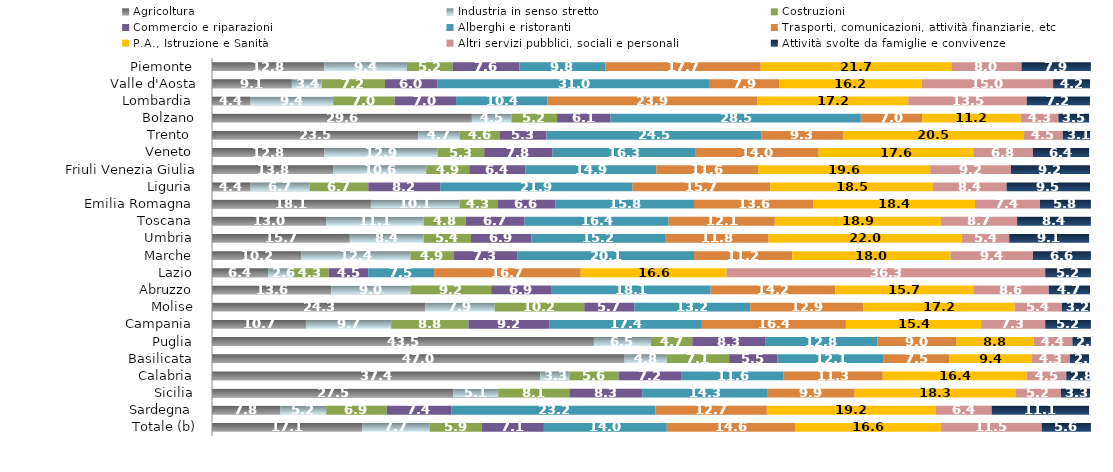
| Category | Agricoltura | Industria in senso stretto | Costruzioni | Commercio e riparazioni | Alberghi e ristoranti | Trasporti, comunicazioni, attività finanziarie, etc | P.A., Istruzione e Sanità | Altri servizi pubblici, sociali e personali | Attività svolte da famiglie e convivenze |
|---|---|---|---|---|---|---|---|---|---|
| Piemonte  | 12.8 | 9.4 | 5.2 | 7.6 | 9.8 | 17.7 | 21.7 | 8 | 7.9 |
| Valle d'Aosta | 9.1 | 3.4 | 7.2 | 6 | 31 | 7.9 | 16.2 | 15 | 4.2 |
| Lombardia  | 4.4 | 9.4 | 7 | 7 | 10.4 | 23.9 | 17.2 | 13.5 | 7.2 |
|           Bolzano | 29.6 | 4.5 | 5.2 | 6.1 | 28.5 | 7 | 11.2 | 4.3 | 3.5 |
|           Trento  | 23.5 | 4.7 | 4.6 | 5.3 | 24.5 | 9.3 | 20.5 | 4.5 | 3.1 |
| Veneto  | 12.8 | 12.9 | 5.3 | 7.8 | 16.3 | 14 | 17.6 | 6.8 | 6.4 |
| Friuli Venezia Giulia | 13.8 | 10.6 | 4.9 | 6.4 | 14.9 | 11.6 | 19.6 | 9.2 | 9.2 |
| Liguria  | 4.4 | 6.7 | 6.7 | 8.2 | 21.9 | 15.7 | 18.5 | 8.4 | 9.5 |
| Emilia Romagna  | 18.1 | 10.1 | 4.3 | 6.6 | 15.8 | 13.6 | 18.4 | 7.4 | 5.8 |
| Toscana  | 13 | 11.1 | 4.8 | 6.7 | 16.4 | 12.1 | 18.9 | 8.7 | 8.4 |
| Umbria  | 15.7 | 8.4 | 5.4 | 6.9 | 15.2 | 11.8 | 22 | 5.4 | 9.1 |
| Marche  | 10.2 | 12.4 | 4.9 | 7.3 | 20.1 | 11.2 | 18 | 9.4 | 6.6 |
| Lazio  | 6.4 | 2.6 | 4.3 | 4.5 | 7.5 | 16.7 | 16.6 | 36.3 | 5.2 |
| Abruzzo  | 13.6 | 9 | 9.2 | 6.9 | 18.1 | 14.2 | 15.7 | 8.6 | 4.7 |
| Molise  | 24.3 | 7.9 | 10.2 | 5.7 | 13.2 | 12.9 | 17.2 | 5.4 | 3.2 |
| Campania  | 10.7 | 9.7 | 8.8 | 9.2 | 17.4 | 16.4 | 15.4 | 7.3 | 5.2 |
| Puglia  | 43.5 | 6.5 | 4.7 | 8.3 | 12.8 | 9 | 8.8 | 4.4 | 2.1 |
| Basilicata  | 47 | 4.8 | 7.1 | 5.5 | 12.1 | 7.5 | 9.4 | 4.3 | 2.2 |
| Calabria  | 37.4 | 3.3 | 5.6 | 7.2 | 11.6 | 11.3 | 16.4 | 4.5 | 2.8 |
| Sicilia  | 27.5 | 5.1 | 8.1 | 8.3 | 14.3 | 9.9 | 18.3 | 5.2 | 3.3 |
| Sardegna  | 7.8 | 5.2 | 6.9 | 7.4 | 23.2 | 12.7 | 19.2 | 6.4 | 11.1 |
| Totale (b) | 17.1 | 7.7 | 5.9 | 7.1 | 14 | 14.6 | 16.6 | 11.5 | 5.6 |